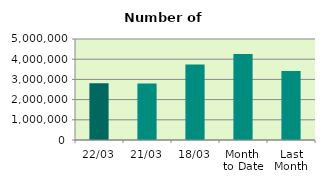
| Category | Series 0 |
|---|---|
| 22/03 | 2812288 |
| 21/03 | 2801728 |
| 18/03 | 3740196 |
| Month 
to Date | 4262506.875 |
| Last
Month | 3413232.3 |